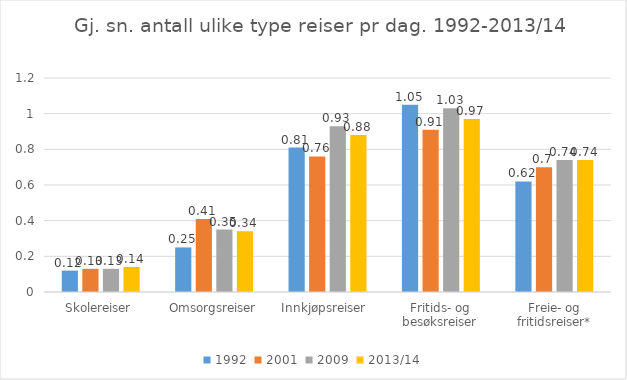
| Category | 1992 | 2001 | 2009 | 2013/14 |
|---|---|---|---|---|
| Skolereiser | 0.12 | 0.13 | 0.13 | 0.14 |
| Omsorgsreiser | 0.25 | 0.41 | 0.35 | 0.34 |
| Innkjøpsreiser  | 0.81 | 0.76 | 0.93 | 0.88 |
| Fritids- og besøksreiser | 1.05 | 0.91 | 1.03 | 0.97 |
| Freie- og fritidsreiser* | 0.62 | 0.7 | 0.74 | 0.74 |